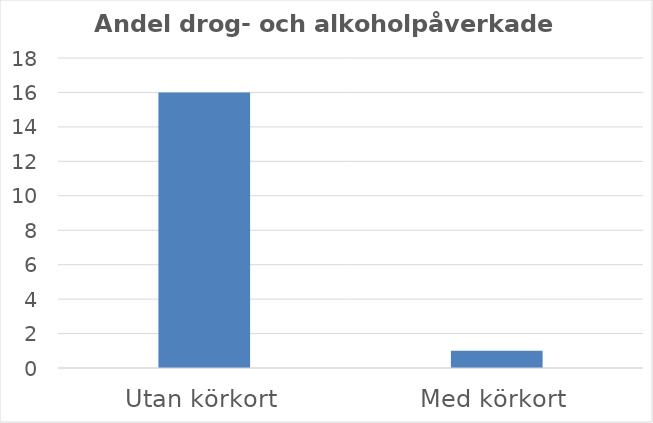
| Category | Andel % |
|---|---|
| Utan körkort | 16 |
| Med körkort | 1 |